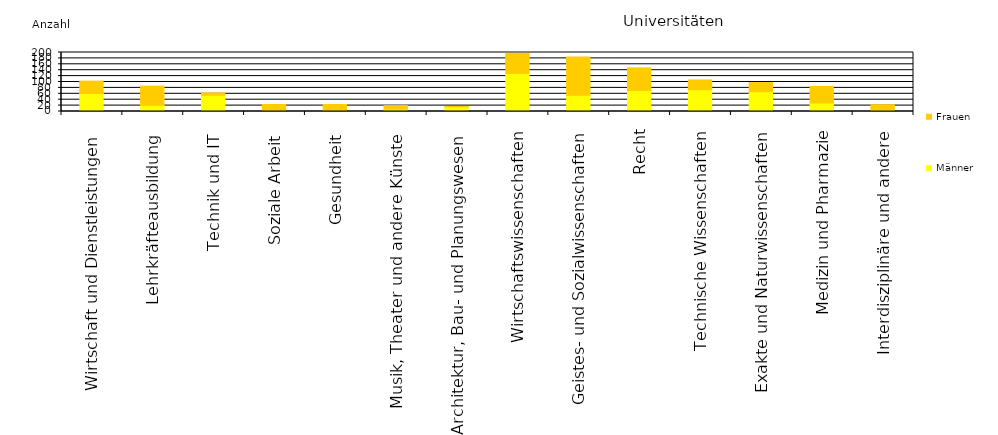
| Category | Männer | Frauen |
|---|---|---|
| Wirtschaft und Dienstleistungen  | 61 | 42 |
| Lehrkräfteausbildung  | 21 | 65 |
| Technik und IT  | 55 | 8 |
| Soziale Arbeit  | 5 | 19 |
| Gesundheit  | 5 | 19 |
| Musik, Theater und andere Künste  | 8 | 12 |
| Architektur, Bau- und Planungswesen  | 16 | 1 |
| Wirtschaftswissenschaften | 129 | 68 |
| Geistes- und Sozialwissenschaften | 55 | 130 |
| Recht | 71 | 77 |
| Technische Wissenschaften | 74 | 33 |
| Exakte und Naturwissenschaften | 67 | 31 |
| Medizin und Pharmazie | 29 | 56 |
| Interdisziplinäre und andere | 7 | 16 |